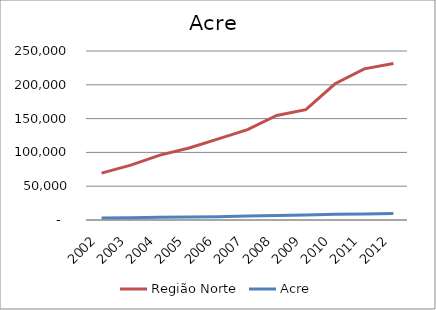
| Category | Região Norte | Acre |
|---|---|---|
| 2002.0 | 69309.957 | 2868.451 |
| 2003.0 | 81199.581 | 3304.771 |
| 2004.0 | 96012.341 | 3940.315 |
| 2005.0 | 106441.71 | 4482.92 |
| 2006.0 | 119993.429 | 4834.62 |
| 2007.0 | 133578.391 | 5760.501 |
| 2008.0 | 154703.433 | 6730.108 |
| 2009.0 | 163207.956 | 7386.436 |
| 2010.0 | 201510.748 | 8476.515 |
| 2011.0 | 223537.9 | 8794.362 |
| 2012.0 | 231383.089 | 9629.239 |